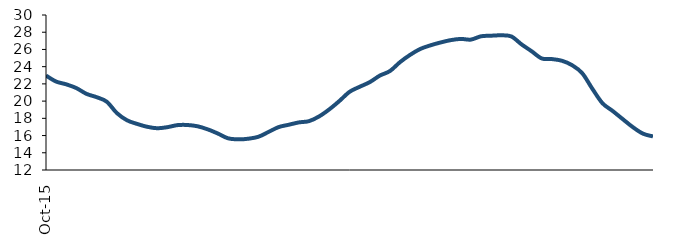
| Category | Series 0 |
|---|---|
| 2015-10-01 | 22.965 |
| 2015-11-01 | 22.271 |
| 2015-12-01 | 21.949 |
| 2016-01-01 | 21.513 |
| 2016-02-01 | 20.844 |
| 2016-03-01 | 20.459 |
| 2016-04-01 | 19.934 |
| 2016-05-01 | 18.618 |
| 2016-06-01 | 17.778 |
| 2016-07-01 | 17.352 |
| 2016-08-01 | 17.019 |
| 2016-09-01 | 16.849 |
| 2016-10-01 | 16.975 |
| 2016-11-01 | 17.212 |
| 2016-12-01 | 17.225 |
| 2017-01-01 | 17.072 |
| 2017-02-01 | 16.714 |
| 2017-03-01 | 16.228 |
| 2017-04-01 | 15.677 |
| 2017-05-01 | 15.559 |
| 2017-06-01 | 15.632 |
| 2017-07-01 | 15.863 |
| 2017-08-01 | 16.424 |
| 2017-09-01 | 16.985 |
| 2017-10-01 | 17.256 |
| 2017-11-01 | 17.527 |
| 2017-12-01 | 17.674 |
| 2018-01-01 | 18.226 |
| 2018-02-01 | 19.041 |
| 2018-03-01 | 20.012 |
| 2018-04-01 | 21.075 |
| 2018-05-01 | 21.662 |
| 2018-06-01 | 22.202 |
| 2018-07-01 | 22.964 |
| 2018-08-01 | 23.494 |
| 2018-09-01 | 24.532 |
| 2018-10-01 | 25.379 |
| 2018-11-01 | 26.061 |
| 2018-12-01 | 26.476 |
| 2019-01-01 | 26.81 |
| 2019-02-01 | 27.08 |
| 2019-03-01 | 27.222 |
| 2019-04-01 | 27.143 |
| 2019-05-01 | 27.528 |
| 2019-06-01 | 27.596 |
| 2019-07-01 | 27.639 |
| 2019-08-01 | 27.508 |
| 2019-09-01 | 26.594 |
| 2019-10-01 | 25.793 |
| 2019-11-01 | 24.956 |
| 2019-12-01 | 24.882 |
| 2020-01-01 | 24.685 |
| 2020-02-01 | 24.173 |
| 2020-03-01 | 23.249 |
| 2020-04-01 | 21.444 |
| 2020-05-01 | 19.761 |
| 2020-06-01 | 18.865 |
| 2020-07-01 | 17.917 |
| 2020-08-01 | 16.982 |
| 2020-09-01 | 16.225 |
| 2020-10-01 | 15.898 |